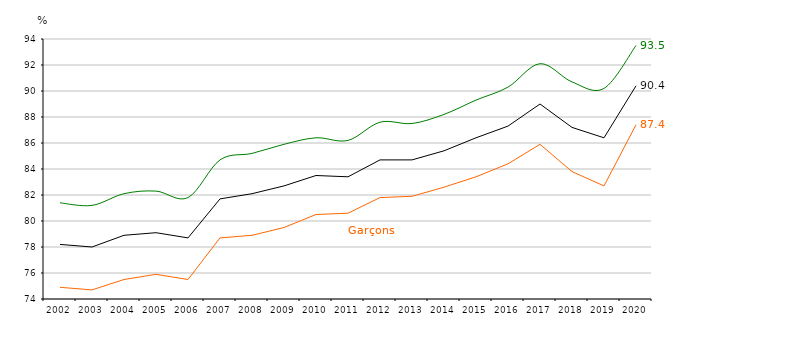
| Category | Garçons | Filles | Ensemble |
|---|---|---|---|
| 2002.0 | 74.9 | 81.4 | 78.2 |
| 2003.0 | 74.7 | 81.2 | 78 |
| 2004.0 | 75.5 | 82.1 | 78.9 |
| 2005.0 | 75.9 | 82.3 | 79.1 |
| 2006.0 | 75.5 | 81.8 | 78.7 |
| 2007.0 | 78.7 | 84.7 | 81.7 |
| 2008.0 | 78.9 | 85.2 | 82.1 |
| 2009.0 | 79.5 | 85.9 | 82.7 |
| 2010.0 | 80.5 | 86.4 | 83.5 |
| 2011.0 | 80.6 | 86.2 | 83.4 |
| 2012.0 | 81.8 | 87.6 | 84.7 |
| 2013.0 | 81.9 | 87.5 | 84.7 |
| 2014.0 | 82.6 | 88.2 | 85.4 |
| 2015.0 | 83.4 | 89.3 | 86.4 |
| 2016.0 | 84.4 | 90.3 | 87.3 |
| 2017.0 | 85.9 | 92.1 | 89 |
| 2018.0 | 83.8 | 90.7 | 87.2 |
| 2019.0 | 82.7 | 90.2 | 86.4 |
| 2020.0 | 87.4 | 93.5 | 90.4 |